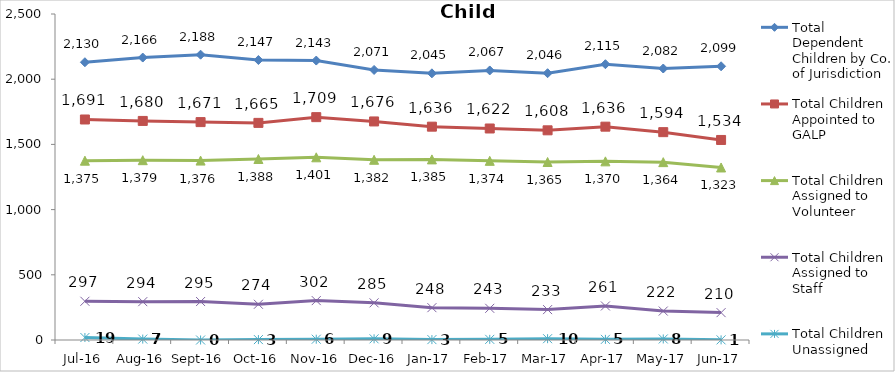
| Category | Total Dependent Children by Co. of Jurisdiction | Total Children Appointed to GALP | Total Children Assigned to Volunteer | Total Children Assigned to Staff | Total Children Unassigned |
|---|---|---|---|---|---|
| Jul-16 | 2130 | 1691 | 1375 | 297 | 19 |
| Aug-16 | 2166 | 1680 | 1379 | 294 | 7 |
| Sep-16 | 2188 | 1671 | 1376 | 295 | 0 |
| Oct-16 | 2147 | 1665 | 1388 | 274 | 3 |
| Nov-16 | 2143 | 1709 | 1401 | 302 | 6 |
| Dec-16 | 2071 | 1676 | 1382 | 285 | 9 |
| Jan-17 | 2045 | 1636 | 1385 | 248 | 3 |
| Feb-17 | 2067 | 1622 | 1374 | 243 | 5 |
| Mar-17 | 2046 | 1608 | 1365 | 233 | 10 |
| Apr-17 | 2115 | 1636 | 1370 | 261 | 5 |
| May-17 | 2082 | 1594 | 1364 | 222 | 8 |
| Jun-17 | 2099 | 1534 | 1323 | 210 | 1 |